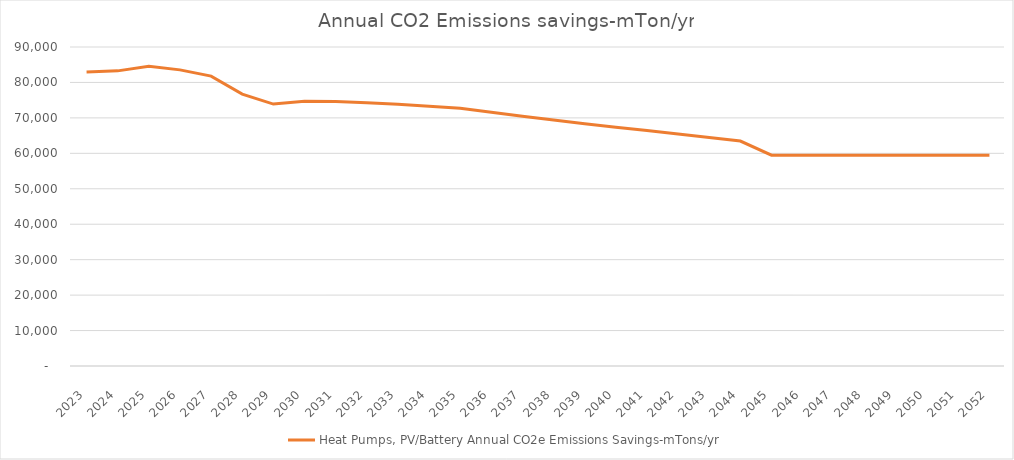
| Category | Heat Pumps, PV/Battery Annual CO2e Emissions Savings-mTons/yr |
|---|---|
| 2023.0 | 82981.508 |
| 2024.0 | 83265.362 |
| 2025.0 | 84581.471 |
| 2026.0 | 83547.632 |
| 2027.0 | 81780.507 |
| 2028.0 | 76724.211 |
| 2029.0 | 73893.642 |
| 2030.0 | 74686.292 |
| 2031.0 | 74605.444 |
| 2032.0 | 74298.26 |
| 2033.0 | 73859.142 |
| 2034.0 | 73311.356 |
| 2035.0 | 72686.27 |
| 2036.0 | 71562.324 |
| 2037.0 | 70467.865 |
| 2038.0 | 69408.198 |
| 2039.0 | 68376.429 |
| 2040.0 | 67370.357 |
| 2041.0 | 66409.414 |
| 2042.0 | 65440.236 |
| 2043.0 | 64459.307 |
| 2044.0 | 63465.044 |
| 2045.0 | 59493.386 |
| 2046.0 | 59493.386 |
| 2047.0 | 59493.386 |
| 2048.0 | 59493.386 |
| 2049.0 | 59493.386 |
| 2050.0 | 59493.386 |
| 2051.0 | 59493.386 |
| 2052.0 | 59493.386 |